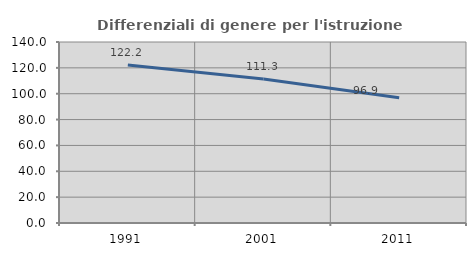
| Category | Differenziali di genere per l'istruzione superiore |
|---|---|
| 1991.0 | 122.184 |
| 2001.0 | 111.347 |
| 2011.0 | 96.919 |